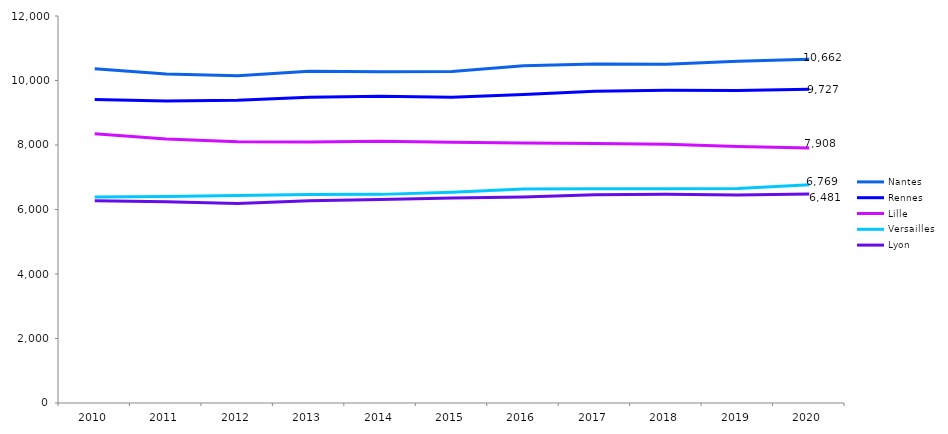
| Category | Nantes | Rennes | Lille | Versailles | Lyon |
|---|---|---|---|---|---|
| 2010.0 | 10363 | 9412 | 8352 | 6390 | 6268 |
| 2011.0 | 10205 | 9366 | 8186 | 6406 | 6239 |
| 2012.0 | 10150 | 9389 | 8097 | 6432 | 6189 |
| 2013.0 | 10285 | 9483 | 8090 | 6466 | 6273 |
| 2014.0 | 10270 | 9511 | 8119 | 6469 | 6312 |
| 2015.0 | 10280 | 9481 | 8083 | 6536 | 6354 |
| 2016.0 | 10455 | 9565 | 8060 | 6634 | 6388 |
| 2017.0 | 10511 | 9664 | 8048 | 6647 | 6460 |
| 2018.0 | 10507 | 9694 | 8026 | 6642 | 6474 |
| 2019.0 | 10597 | 9690 | 7956 | 6655 | 6453 |
| 2020.0 | 10662 | 9727 | 7908 | 6769 | 6481 |